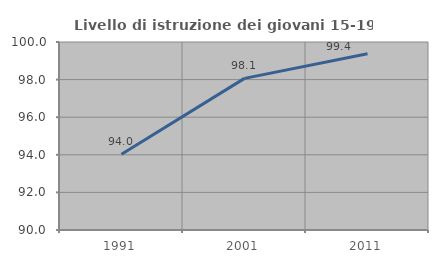
| Category | Livello di istruzione dei giovani 15-19 anni |
|---|---|
| 1991.0 | 94.03 |
| 2001.0 | 98.065 |
| 2011.0 | 99.379 |